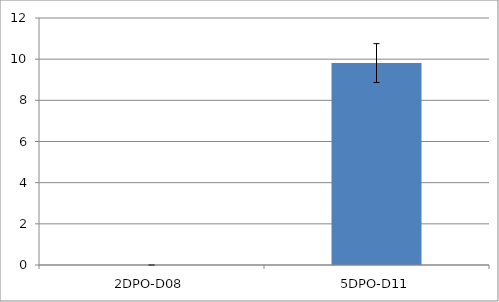
| Category | Series 0 |
|---|---|
| 2DPO-D08 | 0 |
| 5DPO-D11 | 9.811 |